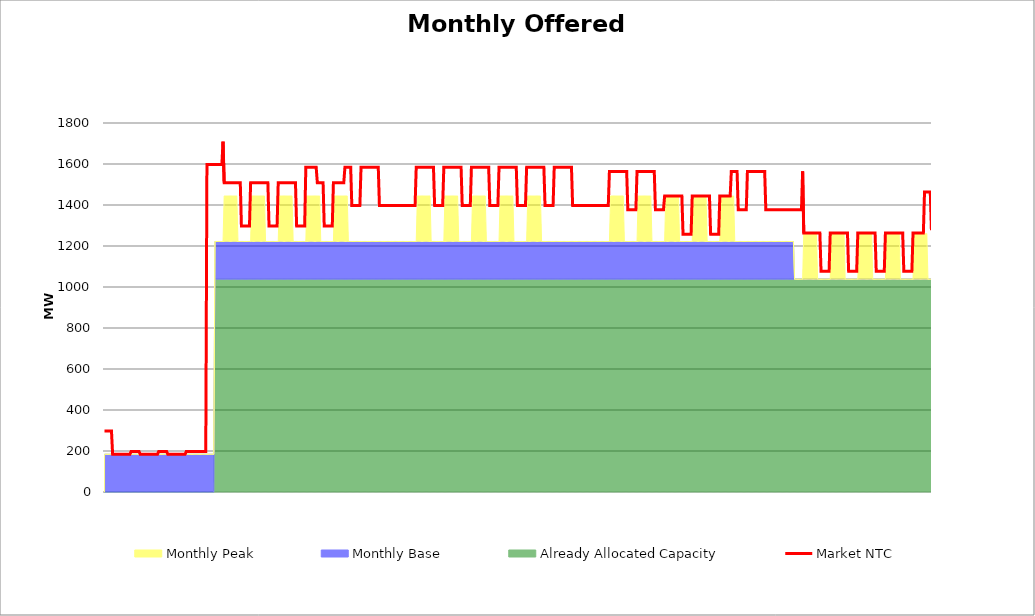
| Category | Market NTC |
|---|---|
| 0 | 297 |
| 1 | 297 |
| 2 | 297 |
| 3 | 297 |
| 4 | 297 |
| 5 | 297 |
| 6 | 297 |
| 7 | 184 |
| 8 | 184 |
| 9 | 184 |
| 10 | 184 |
| 11 | 184 |
| 12 | 184 |
| 13 | 184 |
| 14 | 184 |
| 15 | 184 |
| 16 | 184 |
| 17 | 184 |
| 18 | 184 |
| 19 | 184 |
| 20 | 184 |
| 21 | 184 |
| 22 | 184 |
| 23 | 197 |
| 24 | 197 |
| 25 | 197 |
| 26 | 197 |
| 27 | 197 |
| 28 | 197 |
| 29 | 197 |
| 30 | 197 |
| 31 | 184 |
| 32 | 184 |
| 33 | 184 |
| 34 | 184 |
| 35 | 184 |
| 36 | 184 |
| 37 | 184 |
| 38 | 184 |
| 39 | 184 |
| 40 | 184 |
| 41 | 184 |
| 42 | 184 |
| 43 | 184 |
| 44 | 184 |
| 45 | 184 |
| 46 | 184 |
| 47 | 197 |
| 48 | 197 |
| 49 | 197 |
| 50 | 197 |
| 51 | 197 |
| 52 | 197 |
| 53 | 197 |
| 54 | 197 |
| 55 | 184 |
| 56 | 184 |
| 57 | 184 |
| 58 | 184 |
| 59 | 184 |
| 60 | 184 |
| 61 | 184 |
| 62 | 184 |
| 63 | 184 |
| 64 | 184 |
| 65 | 184 |
| 66 | 184 |
| 67 | 184 |
| 68 | 184 |
| 69 | 184 |
| 70 | 184 |
| 71 | 197 |
| 72 | 197 |
| 73 | 197 |
| 74 | 197 |
| 75 | 197 |
| 76 | 197 |
| 77 | 197 |
| 78 | 197 |
| 79 | 197 |
| 80 | 197 |
| 81 | 197 |
| 82 | 197 |
| 83 | 197 |
| 84 | 197 |
| 85 | 197 |
| 86 | 197 |
| 87 | 197 |
| 88 | 197 |
| 89 | 1597 |
| 90 | 1597 |
| 91 | 1597 |
| 92 | 1597 |
| 93 | 1597 |
| 94 | 1597 |
| 95 | 1597 |
| 96 | 1597 |
| 97 | 1597 |
| 98 | 1597 |
| 99 | 1597 |
| 100 | 1597 |
| 101 | 1597 |
| 102 | 1597 |
| 103 | 1709 |
| 104 | 1509 |
| 105 | 1509 |
| 106 | 1509 |
| 107 | 1509 |
| 108 | 1509 |
| 109 | 1509 |
| 110 | 1509 |
| 111 | 1509 |
| 112 | 1509 |
| 113 | 1509 |
| 114 | 1509 |
| 115 | 1509 |
| 116 | 1509 |
| 117 | 1509 |
| 118 | 1509 |
| 119 | 1297 |
| 120 | 1297 |
| 121 | 1297 |
| 122 | 1297 |
| 123 | 1297 |
| 124 | 1297 |
| 125 | 1297 |
| 126 | 1297 |
| 127 | 1509 |
| 128 | 1509 |
| 129 | 1509 |
| 130 | 1509 |
| 131 | 1509 |
| 132 | 1509 |
| 133 | 1509 |
| 134 | 1509 |
| 135 | 1509 |
| 136 | 1509 |
| 137 | 1509 |
| 138 | 1509 |
| 139 | 1509 |
| 140 | 1509 |
| 141 | 1509 |
| 142 | 1509 |
| 143 | 1297 |
| 144 | 1297 |
| 145 | 1297 |
| 146 | 1297 |
| 147 | 1297 |
| 148 | 1297 |
| 149 | 1297 |
| 150 | 1297 |
| 151 | 1509 |
| 152 | 1509 |
| 153 | 1509 |
| 154 | 1509 |
| 155 | 1509 |
| 156 | 1509 |
| 157 | 1509 |
| 158 | 1509 |
| 159 | 1509 |
| 160 | 1509 |
| 161 | 1509 |
| 162 | 1509 |
| 163 | 1509 |
| 164 | 1509 |
| 165 | 1509 |
| 166 | 1509 |
| 167 | 1297 |
| 168 | 1297 |
| 169 | 1297 |
| 170 | 1297 |
| 171 | 1297 |
| 172 | 1297 |
| 173 | 1297 |
| 174 | 1297 |
| 175 | 1584 |
| 176 | 1584 |
| 177 | 1584 |
| 178 | 1584 |
| 179 | 1584 |
| 180 | 1584 |
| 181 | 1584 |
| 182 | 1584 |
| 183 | 1584 |
| 184 | 1584 |
| 185 | 1509 |
| 186 | 1509 |
| 187 | 1509 |
| 188 | 1509 |
| 189 | 1509 |
| 190 | 1509 |
| 191 | 1297 |
| 192 | 1297 |
| 193 | 1297 |
| 194 | 1297 |
| 195 | 1297 |
| 196 | 1297 |
| 197 | 1297 |
| 198 | 1297 |
| 199 | 1509 |
| 200 | 1509 |
| 201 | 1509 |
| 202 | 1509 |
| 203 | 1509 |
| 204 | 1509 |
| 205 | 1509 |
| 206 | 1509 |
| 207 | 1509 |
| 208 | 1509 |
| 209 | 1584 |
| 210 | 1584 |
| 211 | 1584 |
| 212 | 1584 |
| 213 | 1584 |
| 214 | 1584 |
| 215 | 1397 |
| 216 | 1397 |
| 217 | 1397 |
| 218 | 1397 |
| 219 | 1397 |
| 220 | 1397 |
| 221 | 1397 |
| 222 | 1397 |
| 223 | 1584 |
| 224 | 1584 |
| 225 | 1584 |
| 226 | 1584 |
| 227 | 1584 |
| 228 | 1584 |
| 229 | 1584 |
| 230 | 1584 |
| 231 | 1584 |
| 232 | 1584 |
| 233 | 1584 |
| 234 | 1584 |
| 235 | 1584 |
| 236 | 1584 |
| 237 | 1584 |
| 238 | 1584 |
| 239 | 1397 |
| 240 | 1397 |
| 241 | 1397 |
| 242 | 1397 |
| 243 | 1397 |
| 244 | 1397 |
| 245 | 1397 |
| 246 | 1397 |
| 247 | 1397 |
| 248 | 1397 |
| 249 | 1397 |
| 250 | 1397 |
| 251 | 1397 |
| 252 | 1397 |
| 253 | 1397 |
| 254 | 1397 |
| 255 | 1397 |
| 256 | 1397 |
| 257 | 1397 |
| 258 | 1397 |
| 259 | 1397 |
| 260 | 1397 |
| 261 | 1397 |
| 262 | 1397 |
| 263 | 1397 |
| 264 | 1397 |
| 265 | 1397 |
| 266 | 1397 |
| 267 | 1397 |
| 268 | 1397 |
| 269 | 1397 |
| 270 | 1397 |
| 271 | 1584 |
| 272 | 1584 |
| 273 | 1584 |
| 274 | 1584 |
| 275 | 1584 |
| 276 | 1584 |
| 277 | 1584 |
| 278 | 1584 |
| 279 | 1584 |
| 280 | 1584 |
| 281 | 1584 |
| 282 | 1584 |
| 283 | 1584 |
| 284 | 1584 |
| 285 | 1584 |
| 286 | 1584 |
| 287 | 1397 |
| 288 | 1397 |
| 289 | 1397 |
| 290 | 1397 |
| 291 | 1397 |
| 292 | 1397 |
| 293 | 1397 |
| 294 | 1397 |
| 295 | 1584 |
| 296 | 1584 |
| 297 | 1584 |
| 298 | 1584 |
| 299 | 1584 |
| 300 | 1584 |
| 301 | 1584 |
| 302 | 1584 |
| 303 | 1584 |
| 304 | 1584 |
| 305 | 1584 |
| 306 | 1584 |
| 307 | 1584 |
| 308 | 1584 |
| 309 | 1584 |
| 310 | 1584 |
| 311 | 1397 |
| 312 | 1397 |
| 313 | 1397 |
| 314 | 1397 |
| 315 | 1397 |
| 316 | 1397 |
| 317 | 1397 |
| 318 | 1397 |
| 319 | 1584 |
| 320 | 1584 |
| 321 | 1584 |
| 322 | 1584 |
| 323 | 1584 |
| 324 | 1584 |
| 325 | 1584 |
| 326 | 1584 |
| 327 | 1584 |
| 328 | 1584 |
| 329 | 1584 |
| 330 | 1584 |
| 331 | 1584 |
| 332 | 1584 |
| 333 | 1584 |
| 334 | 1584 |
| 335 | 1397 |
| 336 | 1397 |
| 337 | 1397 |
| 338 | 1397 |
| 339 | 1397 |
| 340 | 1397 |
| 341 | 1397 |
| 342 | 1397 |
| 343 | 1584 |
| 344 | 1584 |
| 345 | 1584 |
| 346 | 1584 |
| 347 | 1584 |
| 348 | 1584 |
| 349 | 1584 |
| 350 | 1584 |
| 351 | 1584 |
| 352 | 1584 |
| 353 | 1584 |
| 354 | 1584 |
| 355 | 1584 |
| 356 | 1584 |
| 357 | 1584 |
| 358 | 1584 |
| 359 | 1397 |
| 360 | 1397 |
| 361 | 1397 |
| 362 | 1397 |
| 363 | 1397 |
| 364 | 1397 |
| 365 | 1397 |
| 366 | 1397 |
| 367 | 1584 |
| 368 | 1584 |
| 369 | 1584 |
| 370 | 1584 |
| 371 | 1584 |
| 372 | 1584 |
| 373 | 1584 |
| 374 | 1584 |
| 375 | 1584 |
| 376 | 1584 |
| 377 | 1584 |
| 378 | 1584 |
| 379 | 1584 |
| 380 | 1584 |
| 381 | 1584 |
| 382 | 1584 |
| 383 | 1397 |
| 384 | 1397 |
| 385 | 1397 |
| 386 | 1397 |
| 387 | 1397 |
| 388 | 1397 |
| 389 | 1397 |
| 390 | 1397 |
| 391 | 1584 |
| 392 | 1584 |
| 393 | 1584 |
| 394 | 1584 |
| 395 | 1584 |
| 396 | 1584 |
| 397 | 1584 |
| 398 | 1584 |
| 399 | 1584 |
| 400 | 1584 |
| 401 | 1584 |
| 402 | 1584 |
| 403 | 1584 |
| 404 | 1584 |
| 405 | 1584 |
| 406 | 1584 |
| 407 | 1397 |
| 408 | 1397 |
| 409 | 1397 |
| 410 | 1397 |
| 411 | 1397 |
| 412 | 1397 |
| 413 | 1397 |
| 414 | 1397 |
| 415 | 1397 |
| 416 | 1397 |
| 417 | 1397 |
| 418 | 1397 |
| 419 | 1397 |
| 420 | 1397 |
| 421 | 1397 |
| 422 | 1397 |
| 423 | 1397 |
| 424 | 1397 |
| 425 | 1397 |
| 426 | 1397 |
| 427 | 1397 |
| 428 | 1397 |
| 429 | 1397 |
| 430 | 1397 |
| 431 | 1397 |
| 432 | 1397 |
| 433 | 1397 |
| 434 | 1397 |
| 435 | 1397 |
| 436 | 1397 |
| 437 | 1397 |
| 438 | 1397 |
| 439 | 1564 |
| 440 | 1564 |
| 441 | 1564 |
| 442 | 1564 |
| 443 | 1564 |
| 444 | 1564 |
| 445 | 1564 |
| 446 | 1564 |
| 447 | 1564 |
| 448 | 1564 |
| 449 | 1564 |
| 450 | 1564 |
| 451 | 1564 |
| 452 | 1564 |
| 453 | 1564 |
| 454 | 1564 |
| 455 | 1377 |
| 456 | 1377 |
| 457 | 1377 |
| 458 | 1377 |
| 459 | 1377 |
| 460 | 1377 |
| 461 | 1377 |
| 462 | 1377 |
| 463 | 1564 |
| 464 | 1564 |
| 465 | 1564 |
| 466 | 1564 |
| 467 | 1564 |
| 468 | 1564 |
| 469 | 1564 |
| 470 | 1564 |
| 471 | 1564 |
| 472 | 1564 |
| 473 | 1564 |
| 474 | 1564 |
| 475 | 1564 |
| 476 | 1564 |
| 477 | 1564 |
| 478 | 1564 |
| 479 | 1377 |
| 480 | 1377 |
| 481 | 1377 |
| 482 | 1377 |
| 483 | 1377 |
| 484 | 1377 |
| 485 | 1377 |
| 486 | 1377 |
| 487 | 1444 |
| 488 | 1444 |
| 489 | 1444 |
| 490 | 1444 |
| 491 | 1444 |
| 492 | 1444 |
| 493 | 1444 |
| 494 | 1444 |
| 495 | 1444 |
| 496 | 1444 |
| 497 | 1444 |
| 498 | 1444 |
| 499 | 1444 |
| 500 | 1444 |
| 501 | 1444 |
| 502 | 1444 |
| 503 | 1257 |
| 504 | 1257 |
| 505 | 1257 |
| 506 | 1257 |
| 507 | 1257 |
| 508 | 1257 |
| 509 | 1257 |
| 510 | 1257 |
| 511 | 1444 |
| 512 | 1444 |
| 513 | 1444 |
| 514 | 1444 |
| 515 | 1444 |
| 516 | 1444 |
| 517 | 1444 |
| 518 | 1444 |
| 519 | 1444 |
| 520 | 1444 |
| 521 | 1444 |
| 522 | 1444 |
| 523 | 1444 |
| 524 | 1444 |
| 525 | 1444 |
| 526 | 1444 |
| 527 | 1257 |
| 528 | 1257 |
| 529 | 1257 |
| 530 | 1257 |
| 531 | 1257 |
| 532 | 1257 |
| 533 | 1257 |
| 534 | 1257 |
| 535 | 1444 |
| 536 | 1444 |
| 537 | 1444 |
| 538 | 1444 |
| 539 | 1444 |
| 540 | 1444 |
| 541 | 1444 |
| 542 | 1444 |
| 543 | 1444 |
| 544 | 1444 |
| 545 | 1564 |
| 546 | 1564 |
| 547 | 1564 |
| 548 | 1564 |
| 549 | 1564 |
| 550 | 1564 |
| 551 | 1377 |
| 552 | 1377 |
| 553 | 1377 |
| 554 | 1377 |
| 555 | 1377 |
| 556 | 1377 |
| 557 | 1377 |
| 558 | 1377 |
| 559 | 1564 |
| 560 | 1564 |
| 561 | 1564 |
| 562 | 1564 |
| 563 | 1564 |
| 564 | 1564 |
| 565 | 1564 |
| 566 | 1564 |
| 567 | 1564 |
| 568 | 1564 |
| 569 | 1564 |
| 570 | 1564 |
| 571 | 1564 |
| 572 | 1564 |
| 573 | 1564 |
| 574 | 1564 |
| 575 | 1377 |
| 576 | 1377 |
| 577 | 1377 |
| 578 | 1377 |
| 579 | 1377 |
| 580 | 1377 |
| 581 | 1377 |
| 582 | 1377 |
| 583 | 1377 |
| 584 | 1377 |
| 585 | 1377 |
| 586 | 1377 |
| 587 | 1377 |
| 588 | 1377 |
| 589 | 1377 |
| 590 | 1377 |
| 591 | 1377 |
| 592 | 1377 |
| 593 | 1377 |
| 594 | 1377 |
| 595 | 1377 |
| 596 | 1377 |
| 597 | 1377 |
| 598 | 1377 |
| 599 | 1377 |
| 600 | 1377 |
| 601 | 1377 |
| 602 | 1377 |
| 603 | 1377 |
| 604 | 1377 |
| 605 | 1377 |
| 606 | 1377 |
| 607 | 1564 |
| 608 | 1264 |
| 609 | 1264 |
| 610 | 1264 |
| 611 | 1264 |
| 612 | 1264 |
| 613 | 1264 |
| 614 | 1264 |
| 615 | 1264 |
| 616 | 1264 |
| 617 | 1264 |
| 618 | 1264 |
| 619 | 1264 |
| 620 | 1264 |
| 621 | 1264 |
| 622 | 1264 |
| 623 | 1077 |
| 624 | 1077 |
| 625 | 1077 |
| 626 | 1077 |
| 627 | 1077 |
| 628 | 1077 |
| 629 | 1077 |
| 630 | 1077 |
| 631 | 1264 |
| 632 | 1264 |
| 633 | 1264 |
| 634 | 1264 |
| 635 | 1264 |
| 636 | 1264 |
| 637 | 1264 |
| 638 | 1264 |
| 639 | 1264 |
| 640 | 1264 |
| 641 | 1264 |
| 642 | 1264 |
| 643 | 1264 |
| 644 | 1264 |
| 645 | 1264 |
| 646 | 1264 |
| 647 | 1077 |
| 648 | 1077 |
| 649 | 1077 |
| 650 | 1077 |
| 651 | 1077 |
| 652 | 1077 |
| 653 | 1077 |
| 654 | 1077 |
| 655 | 1264 |
| 656 | 1264 |
| 657 | 1264 |
| 658 | 1264 |
| 659 | 1264 |
| 660 | 1264 |
| 661 | 1264 |
| 662 | 1264 |
| 663 | 1264 |
| 664 | 1264 |
| 665 | 1264 |
| 666 | 1264 |
| 667 | 1264 |
| 668 | 1264 |
| 669 | 1264 |
| 670 | 1264 |
| 671 | 1077 |
| 672 | 1077 |
| 673 | 1077 |
| 674 | 1077 |
| 675 | 1077 |
| 676 | 1077 |
| 677 | 1077 |
| 678 | 1077 |
| 679 | 1264 |
| 680 | 1264 |
| 681 | 1264 |
| 682 | 1264 |
| 683 | 1264 |
| 684 | 1264 |
| 685 | 1264 |
| 686 | 1264 |
| 687 | 1264 |
| 688 | 1264 |
| 689 | 1264 |
| 690 | 1264 |
| 691 | 1264 |
| 692 | 1264 |
| 693 | 1264 |
| 694 | 1264 |
| 695 | 1077 |
| 696 | 1077 |
| 697 | 1077 |
| 698 | 1077 |
| 699 | 1077 |
| 700 | 1077 |
| 701 | 1077 |
| 702 | 1077 |
| 703 | 1264 |
| 704 | 1264 |
| 705 | 1264 |
| 706 | 1264 |
| 707 | 1264 |
| 708 | 1264 |
| 709 | 1264 |
| 710 | 1264 |
| 711 | 1264 |
| 712 | 1264 |
| 713 | 1464 |
| 714 | 1464 |
| 715 | 1464 |
| 716 | 1464 |
| 717 | 1464 |
| 718 | 1464 |
| 719 | 1277 |